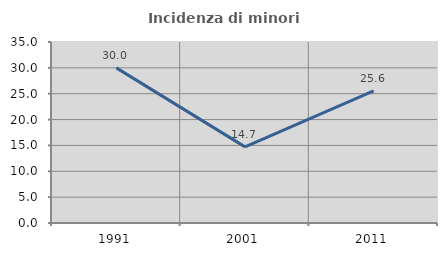
| Category | Incidenza di minori stranieri |
|---|---|
| 1991.0 | 30 |
| 2001.0 | 14.724 |
| 2011.0 | 25.556 |